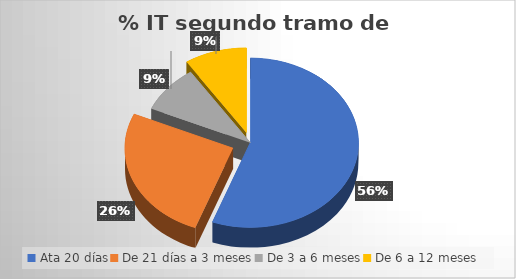
| Category | Total |
|---|---|
| Ata 20 días | 466 |
| De 21 días a 3 meses | 217 |
| De 3 a 6 meses | 76 |
| De 6 a 12 meses | 78 |